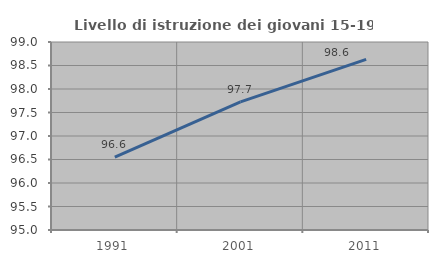
| Category | Livello di istruzione dei giovani 15-19 anni |
|---|---|
| 1991.0 | 96.552 |
| 2001.0 | 97.727 |
| 2011.0 | 98.63 |